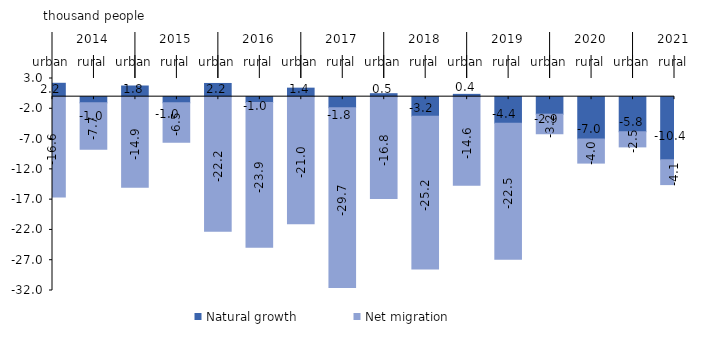
| Category | Natural growth | Net migration |
|---|---|---|
| 0 | 2.21 | -16.559 |
| 1 | -1.023 | -7.665 |
| 2 | 1.762 | -14.949 |
| 3 | -1.015 | -6.494 |
| 4 | 2.181 | -22.215 |
| 5 | -0.953 | -23.887 |
| 6 | 1.407 | -20.978 |
| 7 | -1.823 | -29.701 |
| 8 | 0.492 | -16.807 |
| 9 | -3.218 | -25.242 |
| 10 | 0.38 | -14.639 |
| 11 | -4.368 | -22.454 |
| 12 | -2.892 | -3.229 |
| 13 | -6.991 | -3.976 |
| 14 | -5.791 | -2.5 |
| 15 | -10.416 | -4.1 |